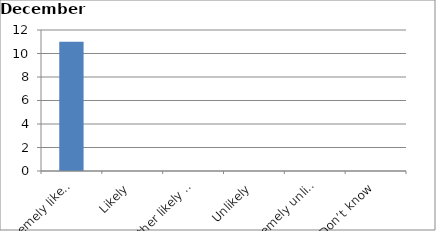
| Category | Series 0 |
|---|---|
| Extremely likely | 11 |
| Likely | 0 |
| Neither likely nor unlikely | 0 |
| Unlikely | 0 |
| Extremely unlikely | 0 |
| Don’t know | 0 |